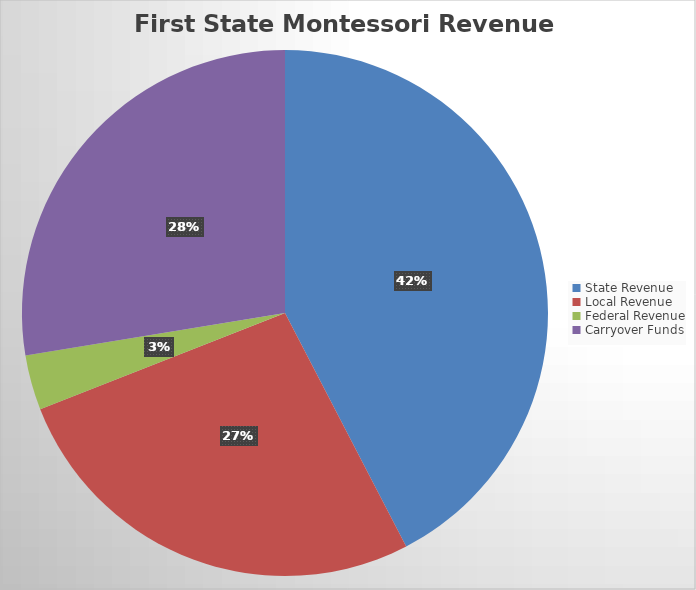
| Category | Series 0 |
|---|---|
| State Revenue | 4560940 |
| Local Revenue | 2870025.11 |
| Federal Revenue | 362528 |
| Carryover Funds | 2969055.99 |